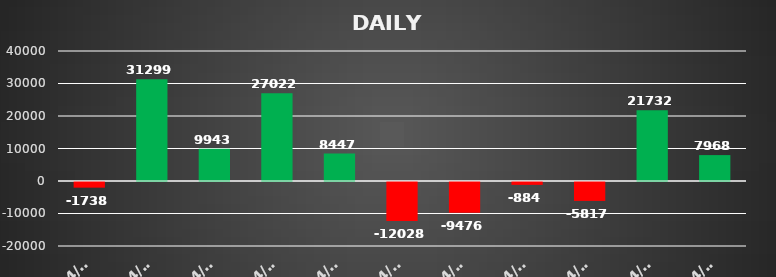
| Category | Series 0 |
|---|---|
| 2021-04-05 | -1737.81 |
| 2021-04-06 | 31299.4 |
| 2021-04-07 | 9942.975 |
| 2021-04-08 | 27022.38 |
| 2021-04-15 | 8446.975 |
| 2021-04-16 | -12027.68 |
| 2021-04-19 | -9476.016 |
| 2021-04-22 | -884.025 |
| 2021-04-23 | -5817.019 |
| 2021-04-27 | 21731.7 |
| 2021-04-28 | 7967.52 |